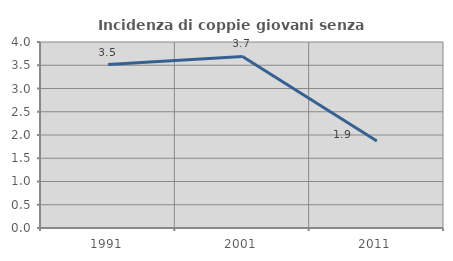
| Category | Incidenza di coppie giovani senza figli |
|---|---|
| 1991.0 | 3.515 |
| 2001.0 | 3.69 |
| 2011.0 | 1.869 |